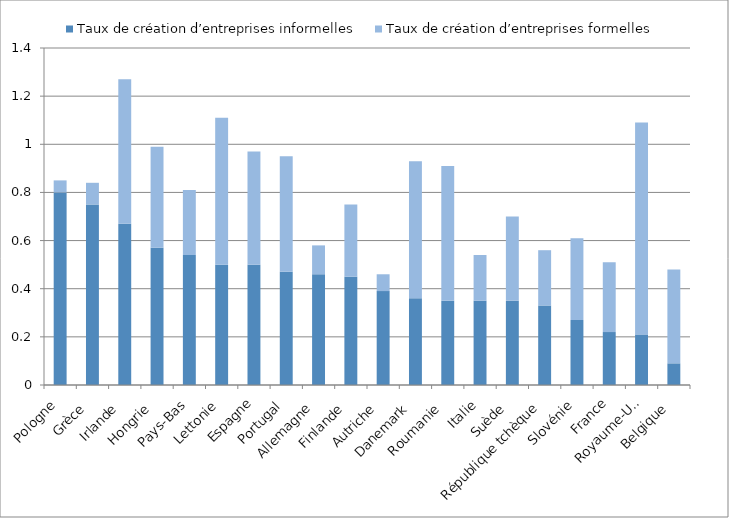
| Category | Informal start-up rate  | Formal start-up rate |
|---|---|---|
| Poland | 0.8 | 0.05 |
| Greece  | 0.75 | 0.09 |
| Ireland  | 0.67 | 0.6 |
| Hungary  | 0.57 | 0.42 |
| Netherlands  | 0.54 | 0.27 |
| Latvia | 0.5 | 0.61 |
| Spain | 0.5 | 0.47 |
| Portugal  | 0.47 | 0.48 |
| Germany  | 0.46 | 0.12 |
| Finland  | 0.45 | 0.3 |
| Austria  | 0.39 | 0.07 |
| Denmark  | 0.36 | 0.57 |
| Romania  | 0.35 | 0.56 |
| Italy  | 0.35 | 0.19 |
| Sweden  | 0.35 | 0.35 |
| Czech Republic  | 0.33 | 0.23 |
| Slovenia | 0.27 | 0.34 |
| France | 0.22 | 0.29 |
| United Kingdom | 0.21 | 0.88 |
| Belgium  | 0.09 | 0.39 |